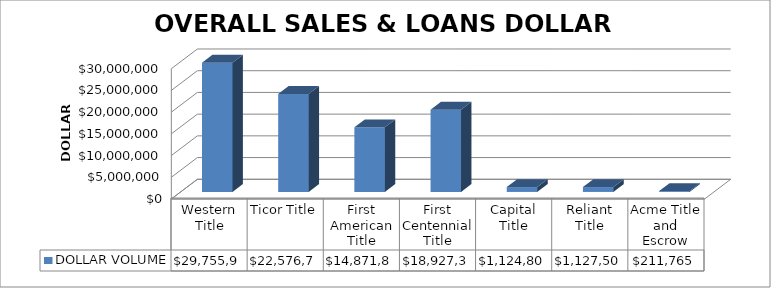
| Category | DOLLAR VOLUME |
|---|---|
| Western Title | 29755968 |
| Ticor Title | 22576736.15 |
| First American Title | 14871820 |
| First Centennial Title | 18927300 |
| Capital Title | 1124800 |
| Reliant Title | 1127500 |
| Acme Title and Escrow | 211765 |